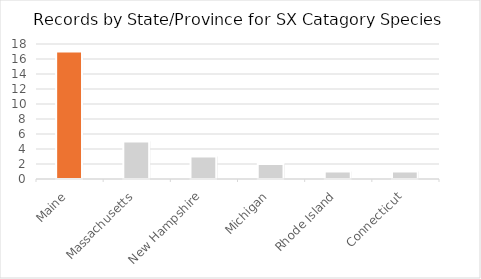
| Category | Total |
|---|---|
| Maine | 17 |
| Massachusetts | 5 |
| New Hampshire | 3 |
| Michigan | 2 |
| Rhode Island | 1 |
| Connecticut | 1 |